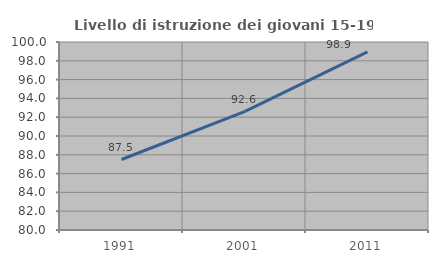
| Category | Livello di istruzione dei giovani 15-19 anni |
|---|---|
| 1991.0 | 87.5 |
| 2001.0 | 92.593 |
| 2011.0 | 98.947 |